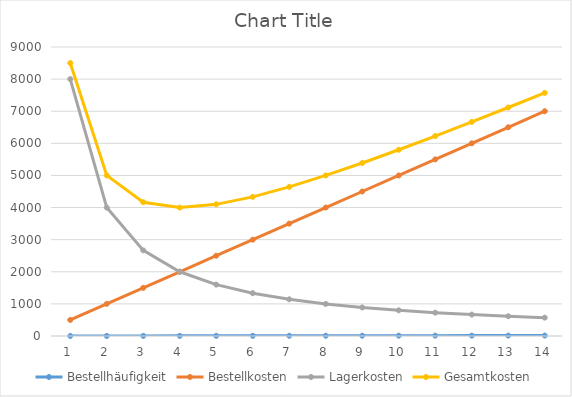
| Category | Bestellhäufigkeit | Bestellkosten | Lagerkosten | Gesamtkosten |
|---|---|---|---|---|
| 0 | 1 | 500 | 8000 | 8500 |
| 1 | 2 | 1000 | 4000 | 5000 |
| 2 | 3 | 1500 | 2666.667 | 4166.667 |
| 3 | 4 | 2000 | 2000 | 4000 |
| 4 | 5 | 2500 | 1600 | 4100 |
| 5 | 6 | 3000 | 1333.333 | 4333.333 |
| 6 | 7 | 3500 | 1142.857 | 4642.857 |
| 7 | 8 | 4000 | 1000 | 5000 |
| 8 | 9 | 4500 | 888.889 | 5388.889 |
| 9 | 10 | 5000 | 800 | 5800 |
| 10 | 11 | 5500 | 727.273 | 6227.273 |
| 11 | 12 | 6000 | 666.667 | 6666.667 |
| 12 | 13 | 6500 | 615.385 | 7115.385 |
| 13 | 14 | 7000 | 571.429 | 7571.429 |